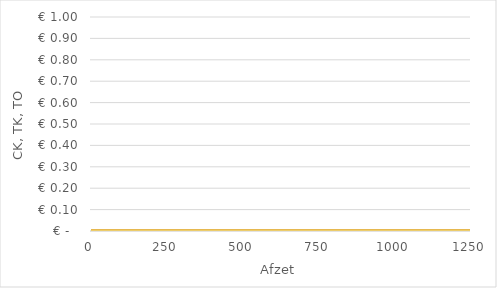
| Category | Constante kosten | Totale kosten | Totale opbrengsten |
|---|---|---|---|
| 0.0 | 0 | 0 | 0 |
| 250.0 | 0 | 0 | 0 |
| 500.0 | 0 | 0 | 0 |
| 750.0 | 0 | 0 | 0 |
| 1000.0 | 0 | 0 | 0 |
| 1250.0 | 0 | 0 | 0 |